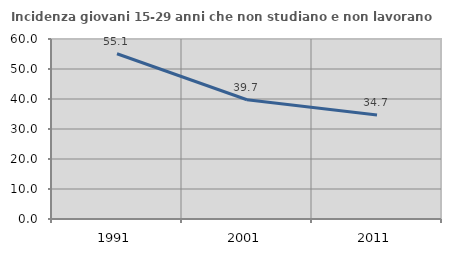
| Category | Incidenza giovani 15-29 anni che non studiano e non lavorano  |
|---|---|
| 1991.0 | 55.09 |
| 2001.0 | 39.748 |
| 2011.0 | 34.691 |